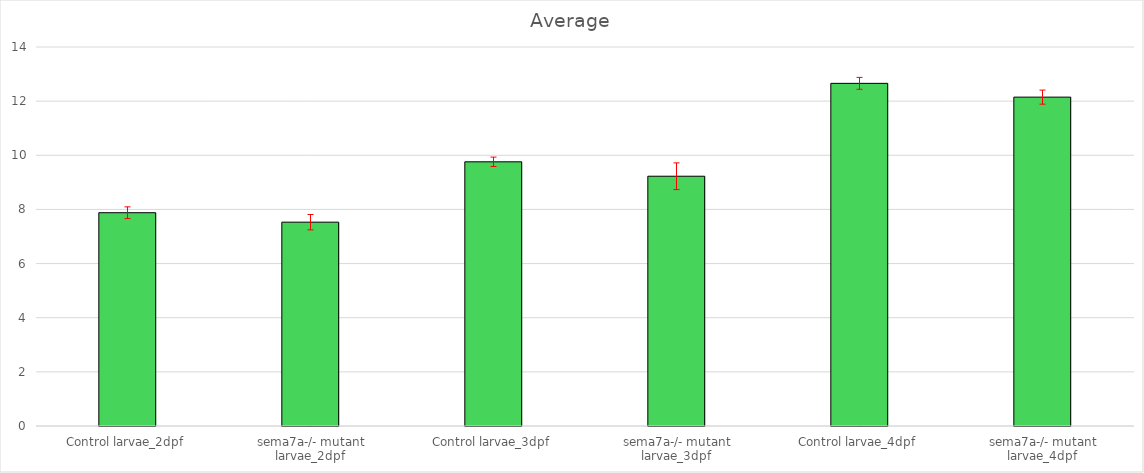
| Category | Average |
|---|---|
| Control larvae_2dpf | 7.879 |
| sema7a-/- mutant larvae_2dpf | 7.529 |
| Control larvae_3dpf | 9.759 |
| sema7a-/- mutant larvae_3dpf | 9.226 |
| Control larvae_4dpf | 12.657 |
| sema7a-/- mutant larvae_4dpf | 12.148 |